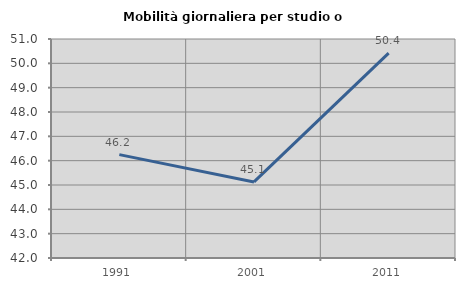
| Category | Mobilità giornaliera per studio o lavoro |
|---|---|
| 1991.0 | 46.248 |
| 2001.0 | 45.127 |
| 2011.0 | 50.421 |